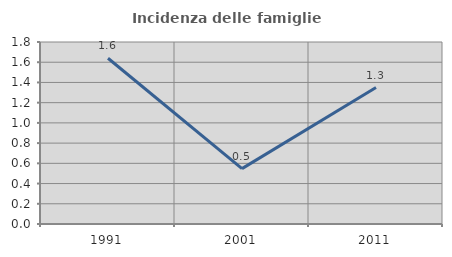
| Category | Incidenza delle famiglie numerose |
|---|---|
| 1991.0 | 1.639 |
| 2001.0 | 0.548 |
| 2011.0 | 1.35 |